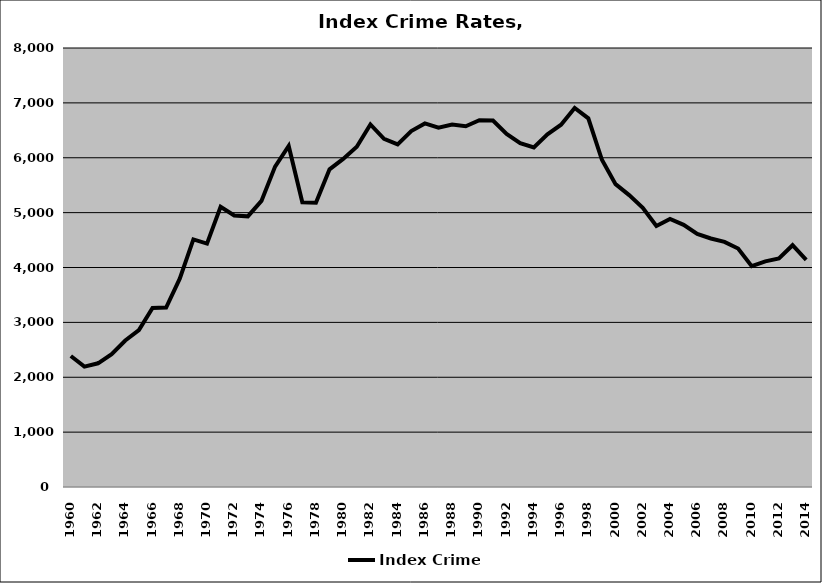
| Category | Index Crime |
|---|---|
| 1960.0 | 2386.588 |
| 1961.0 | 2192.37 |
| 1962.0 | 2254.118 |
| 1963.0 | 2422.299 |
| 1964.0 | 2670.238 |
| 1965.0 | 2859.67 |
| 1966.0 | 3263.601 |
| 1967.0 | 3270.389 |
| 1968.0 | 3797.044 |
| 1969.0 | 4512.475 |
| 1970.0 | 4436.024 |
| 1971.0 | 5105.728 |
| 1972.0 | 4948.357 |
| 1973.0 | 4932.098 |
| 1974.0 | 5212.923 |
| 1975.0 | 5839.407 |
| 1976.0 | 6214.983 |
| 1977.0 | 5187.647 |
| 1978.0 | 5180.363 |
| 1979.0 | 5788.477 |
| 1980.0 | 5979.047 |
| 1981.0 | 6200.603 |
| 1982.0 | 6607.653 |
| 1983.0 | 6346.176 |
| 1984.0 | 6243.399 |
| 1985.0 | 6486.207 |
| 1986.0 | 6625.896 |
| 1987.0 | 6546.8 |
| 1988.0 | 6606.291 |
| 1989.0 | 6573.822 |
| 1990.0 | 6684.118 |
| 1991.0 | 6679.328 |
| 1992.0 | 6434.092 |
| 1993.0 | 6266.089 |
| 1994.0 | 6187.787 |
| 1995.0 | 6428.012 |
| 1996.0 | 6602.277 |
| 1997.0 | 6906.532 |
| 1998.0 | 6719.113 |
| 1999.0 | 5962.604 |
| 2000.0 | 5518.882 |
| 2001.0 | 5318.758 |
| 2002.0 | 5086.056 |
| 2003.0 | 4756.351 |
| 2004.0 | 4885.744 |
| 2005.0 | 4777.971 |
| 2006.0 | 4611.79 |
| 2007.0 | 4528.673 |
| 2008.0 | 4467.569 |
| 2009.0 | 4346.383 |
| 2010.0 | 4024.322 |
| 2011.0 | 4110.938 |
| 2012.0 | 4163.779 |
| 2013.0 | 4405.972 |
| 2014.0 | 4139.68 |